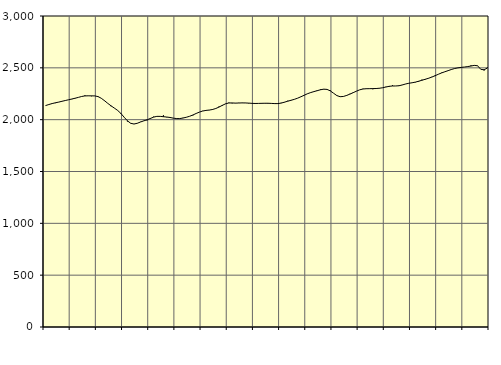
| Category | Piggar | Series 1 |
|---|---|---|
| nan | 2134.4 | 2136.11 |
| 87.0 | 2146.2 | 2146.18 |
| 87.0 | 2157.8 | 2155.55 |
| 87.0 | 2159.8 | 2162.88 |
| nan | 2168.8 | 2169.55 |
| 88.0 | 2177.6 | 2177.21 |
| 88.0 | 2183.8 | 2184.73 |
| 88.0 | 2192.1 | 2191.84 |
| nan | 2197.4 | 2199.26 |
| 89.0 | 2208.6 | 2206.71 |
| 89.0 | 2214.6 | 2215 |
| 89.0 | 2223 | 2223.6 |
| nan | 2234.6 | 2229.07 |
| 90.0 | 2229.1 | 2230.02 |
| 90.0 | 2225.9 | 2229.69 |
| 90.0 | 2230.2 | 2229.18 |
| nan | 2224.9 | 2222.76 |
| 91.0 | 2206 | 2206.45 |
| 91.0 | 2180.3 | 2182.7 |
| 91.0 | 2157.2 | 2157.04 |
| nan | 2129.4 | 2133.22 |
| 92.0 | 2112.6 | 2111.69 |
| 92.0 | 2090.5 | 2089.36 |
| 92.0 | 2064.3 | 2059.94 |
| nan | 2024.4 | 2023.58 |
| 93.0 | 1982.4 | 1988.72 |
| 93.0 | 1966.5 | 1965.09 |
| 93.0 | 1957.5 | 1958.14 |
| nan | 1966.1 | 1965.03 |
| 94.0 | 1979.1 | 1977.59 |
| 94.0 | 1989.9 | 1988.53 |
| 94.0 | 1992.7 | 1998.6 |
| nan | 2006.9 | 2011.55 |
| 95.0 | 2029 | 2024.65 |
| 95.0 | 2031.7 | 2031.88 |
| 95.0 | 2031.8 | 2031.65 |
| nan | 2041.9 | 2028.54 |
| 96.0 | 2023.4 | 2025.51 |
| 96.0 | 2024.2 | 2021.1 |
| 96.0 | 2016 | 2014.97 |
| nan | 2007.6 | 2010.35 |
| 97.0 | 2009.7 | 2010.63 |
| 97.0 | 2017.7 | 2015.91 |
| 97.0 | 2024 | 2023.25 |
| nan | 2032.2 | 2032.53 |
| 98.0 | 2041.2 | 2045.12 |
| 98.0 | 2058.9 | 2059.7 |
| 98.0 | 2073.5 | 2072.91 |
| nan | 2084.9 | 2083.36 |
| 99.0 | 2089.5 | 2089.2 |
| 99.0 | 2091.5 | 2092.69 |
| 99.0 | 2094.6 | 2098.01 |
| nan | 2106.5 | 2107.72 |
| 0.0 | 2127.1 | 2121.7 |
| 0.0 | 2132.8 | 2138.15 |
| 0.0 | 2154.4 | 2153.01 |
| nan | 2164.4 | 2160.94 |
| 1.0 | 2157.6 | 2161.31 |
| 1.0 | 2161 | 2159.67 |
| 1.0 | 2162.2 | 2160.54 |
| nan | 2162.4 | 2161.72 |
| 2.0 | 2162.1 | 2161.2 |
| 2.0 | 2157.4 | 2159.76 |
| 2.0 | 2159.9 | 2157.56 |
| nan | 2153.9 | 2156.13 |
| 3.0 | 2156 | 2156.73 |
| 3.0 | 2160.7 | 2157.69 |
| 3.0 | 2156.9 | 2158.35 |
| nan | 2155.5 | 2158.25 |
| 4.0 | 2155.3 | 2156.82 |
| 4.0 | 2151.8 | 2155.11 |
| 4.0 | 2153 | 2155.02 |
| nan | 2162.8 | 2159.91 |
| 5.0 | 2167 | 2168.8 |
| 5.0 | 2182.6 | 2178.17 |
| 5.0 | 2188.6 | 2187.01 |
| nan | 2195.5 | 2196.01 |
| 6.0 | 2207.5 | 2207.14 |
| 6.0 | 2220 | 2220.74 |
| 6.0 | 2233.2 | 2235.33 |
| nan | 2248.6 | 2249.71 |
| 7.0 | 2262.7 | 2261.38 |
| 7.0 | 2271.8 | 2270.66 |
| 7.0 | 2276.2 | 2279.77 |
| nan | 2293 | 2288.53 |
| 8.0 | 2292.1 | 2294.26 |
| 8.0 | 2291 | 2291.93 |
| 8.0 | 2282 | 2277.69 |
| nan | 2255.1 | 2254.99 |
| 9.0 | 2230.4 | 2232.28 |
| 9.0 | 2220.5 | 2221.66 |
| 9.0 | 2225.1 | 2223.91 |
| nan | 2230.2 | 2233.83 |
| 10.0 | 2249.5 | 2246.64 |
| 10.0 | 2257.1 | 2260.58 |
| 10.0 | 2275.6 | 2275.14 |
| nan | 2287.9 | 2288.1 |
| 11.0 | 2298.1 | 2295.9 |
| 11.0 | 2300.8 | 2298.43 |
| 11.0 | 2297.4 | 2299.09 |
| nan | 2293.3 | 2299.61 |
| 12.0 | 2303.4 | 2300.49 |
| 12.0 | 2300.8 | 2303.14 |
| 12.0 | 2308.4 | 2307.95 |
| nan | 2317.5 | 2314.89 |
| 13.0 | 2316.4 | 2321.88 |
| 13.0 | 2331.6 | 2324.9 |
| 13.0 | 2325.2 | 2325.11 |
| nan | 2325 | 2327.26 |
| 14.0 | 2336.1 | 2334.56 |
| 14.0 | 2343.5 | 2344.07 |
| 14.0 | 2350.3 | 2351 |
| nan | 2356.7 | 2356.07 |
| 15.0 | 2360 | 2362.15 |
| 15.0 | 2366 | 2370.75 |
| 15.0 | 2385.9 | 2380.11 |
| nan | 2386 | 2389.49 |
| 16.0 | 2400.9 | 2399.1 |
| 16.0 | 2412.9 | 2410.44 |
| 16.0 | 2420.6 | 2423.72 |
| nan | 2437.5 | 2437.72 |
| 17.0 | 2453.2 | 2450.67 |
| 17.0 | 2461.6 | 2461.95 |
| 17.0 | 2472.1 | 2472.85 |
| nan | 2486.5 | 2483.95 |
| 18.0 | 2492.3 | 2493.32 |
| 18.0 | 2499 | 2499.82 |
| 18.0 | 2501.5 | 2504.18 |
| nan | 2508 | 2507.83 |
| 19.0 | 2510.4 | 2512.19 |
| 19.0 | 2523.4 | 2517.51 |
| 19.0 | 2521.5 | 2523.5 |
| nan | 2522 | 2520 |
| 20.0 | 2485.9 | 2485.29 |
| 20.0 | 2474.2 | 2481.39 |
| 20.0 | 2503.7 | 2497.72 |